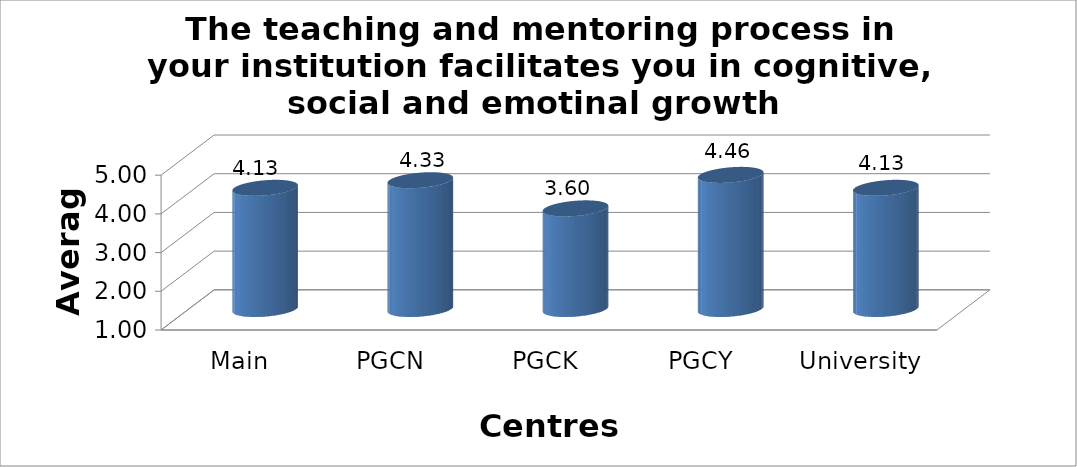
| Category | The teaching and mentoring process in your institution facilitates you in cognitive, social and emotinal growth  |
|---|---|
| Main Campus | 4.13 |
| PGCN | 4.327 |
| PGCK | 3.599 |
| PGCY | 4.464 |
| University Avg | 4.13 |